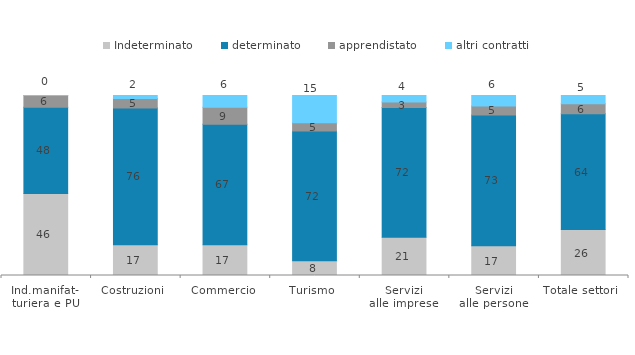
| Category | Indeterminato | determinato | apprendistato | altri contratti |
|---|---|---|---|---|
| Ind.manifat-
turiera e PU | 45.567 | 47.969 | 6.429 | 0.035 |
| Costruzioni | 17.152 | 75.957 | 5.207 | 1.685 |
| Commercio | 17.105 | 66.941 | 9.457 | 6.497 |
| Turismo | 8.129 | 72.139 | 4.578 | 15.154 |
| Servizi
alle imprese | 21.228 | 72.127 | 3.046 | 3.599 |
| Servizi
alle persone | 16.523 | 72.684 | 4.967 | 5.826 |
| Totale settori | 25.553 | 64.329 | 5.522 | 4.596 |